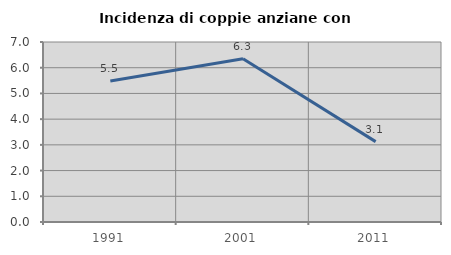
| Category | Incidenza di coppie anziane con figli |
|---|---|
| 1991.0 | 5.479 |
| 2001.0 | 6.349 |
| 2011.0 | 3.125 |